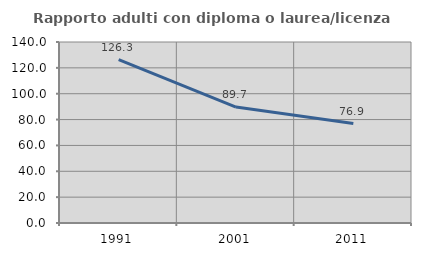
| Category | Rapporto adulti con diploma o laurea/licenza media  |
|---|---|
| 1991.0 | 126.316 |
| 2001.0 | 89.655 |
| 2011.0 | 76.923 |